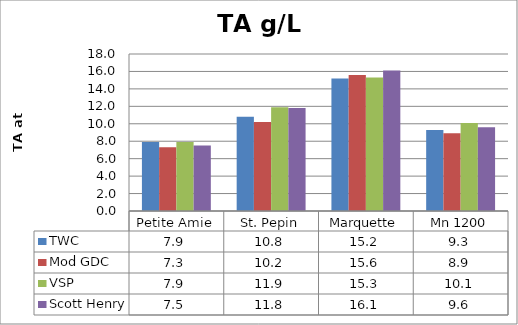
| Category | TWC | Mod GDC | VSP | Scott Henry |
|---|---|---|---|---|
| 0 | 7.9 | 7.3 | 7.9 | 7.5 |
| 1 | 10.8 | 10.2 | 11.9 | 11.8 |
| 2 | 15.2 | 15.6 | 15.3 | 16.1 |
| 3 | 9.3 | 8.9 | 10.1 | 9.6 |